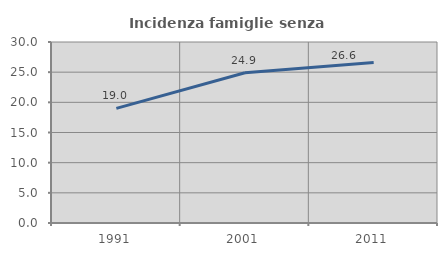
| Category | Incidenza famiglie senza nuclei |
|---|---|
| 1991.0 | 19.005 |
| 2001.0 | 24.913 |
| 2011.0 | 26.619 |